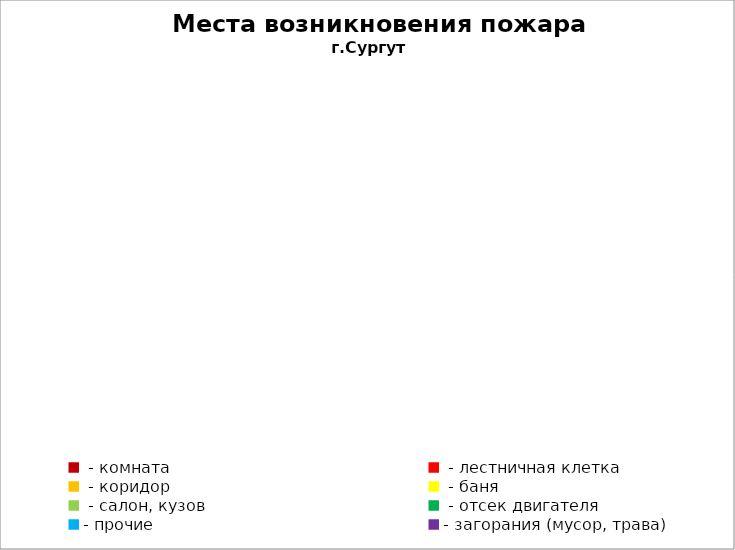
| Category | Места возникновения пожара |
|---|---|
|  - комната | 66 |
|  - лестничная клетка | 10 |
|  - коридор | 7 |
|  - баня | 32 |
|  - салон, кузов | 13 |
|  - отсек двигателя | 38 |
| - прочие | 107 |
| - загорания (мусор, трава)  | 40 |